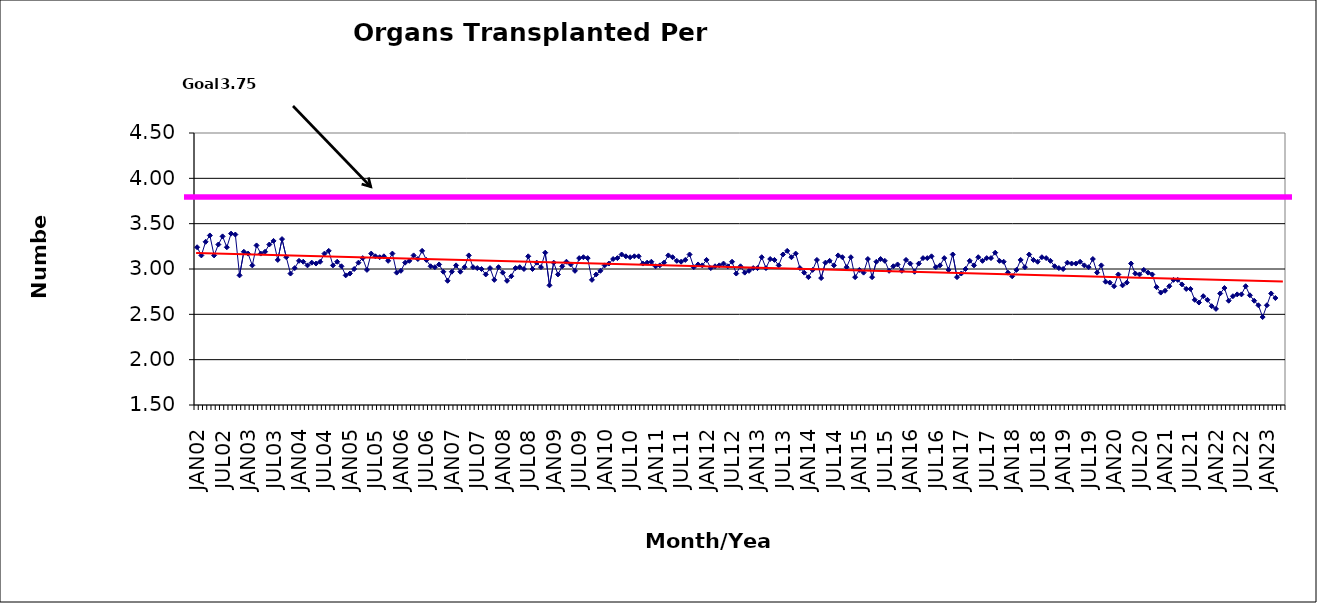
| Category | Series 0 |
|---|---|
| JAN02 | 3.24 |
| FEB02 | 3.15 |
| MAR02 | 3.3 |
| APR02 | 3.37 |
| MAY02 | 3.15 |
| JUN02 | 3.27 |
| JUL02 | 3.36 |
| AUG02 | 3.24 |
| SEP02 | 3.39 |
| OCT02 | 3.38 |
| NOV02 | 2.93 |
| DEC02 | 3.19 |
| JAN03 | 3.17 |
| FEB03 | 3.04 |
| MAR03 | 3.26 |
| APR03 | 3.17 |
| MAY03 | 3.19 |
| JUN03 | 3.27 |
| JUL03 | 3.31 |
| AUG03 | 3.1 |
| SEP03 | 3.33 |
| OCT03 | 3.13 |
| NOV03 | 2.95 |
| DEC03 | 3.01 |
| JAN04 | 3.09 |
| FEB04 | 3.08 |
| MAR04 | 3.04 |
| APR04 | 3.07 |
| MAY04 | 3.06 |
| JUN04 | 3.08 |
| JUL04 | 3.17 |
| AUG04 | 3.2 |
| SEP04 | 3.04 |
| OCT04 | 3.08 |
| NOV04 | 3.03 |
| DEC04 | 2.93 |
| JAN05 | 2.95 |
| FEB05 | 3 |
| MAR05 | 3.07 |
| APR05 | 3.12 |
| MAY05 | 2.99 |
| JUN05 | 3.17 |
| JUL05 | 3.14 |
| AUG05 | 3.13 |
| SEP05 | 3.14 |
| OCT05 | 3.09 |
| NOV05 | 3.17 |
| DEC05 | 2.96 |
| JAN06 | 2.98 |
| FEB06 | 3.07 |
| MAR06 | 3.09 |
| APR06 | 3.15 |
| MAY06 | 3.11 |
| JUN06 | 3.2 |
| JUL06 | 3.1 |
| AUG06 | 3.03 |
| SEP06 | 3.02 |
| OCT06 | 3.05 |
| NOV06 | 2.97 |
| DEC06 | 2.87 |
| JAN07 | 2.97 |
| FEB07 | 3.04 |
| MAR07 | 2.97 |
| APR07 | 3.02 |
| MAY07 | 3.15 |
| JUN07 | 3.02 |
| JUL07 | 3.01 |
| AUG07 | 3 |
| SEP07 | 2.94 |
| OCT07 | 3.01 |
| NOV07 | 2.88 |
| DEC07 | 3.02 |
| JAN08 | 2.96 |
| FEB08 | 2.87 |
| MAR08 | 2.92 |
| APR08 | 3.01 |
| MAY08 | 3.02 |
| JUN08 | 3 |
| JUL08 | 3.14 |
| AUG08 | 3 |
| SEP08 | 3.07 |
| OCT08 | 3.02 |
| NOV08 | 3.18 |
| DEC08 | 2.82 |
| JAN09 | 3.07 |
| FEB09 | 2.94 |
| MAR09 | 3.03 |
| APR09 | 3.08 |
| MAY09 | 3.05 |
| JUN09 | 2.98 |
| JUL09 | 3.12 |
| AUG09 | 3.13 |
| SEP09 | 3.12 |
| OCT09 | 2.88 |
| NOV09 | 2.94 |
| DEC09 | 2.98 |
| JAN10 | 3.04 |
| FEB10 | 3.06 |
| MAR10 | 3.11 |
| APR10 | 3.12 |
| MAY10 | 3.16 |
| JUN10 | 3.14 |
| JUL10 | 3.13 |
| AUG10 | 3.14 |
| SEP10 | 3.14 |
| OCT10 | 3.06 |
| NOV10 | 3.07 |
| DEC10 | 3.08 |
| JAN11 | 3.03 |
| FEB11 | 3.04 |
| MAR11 | 3.07 |
| APR11 | 3.15 |
| MAY11 | 3.13 |
| JUN11 | 3.09 |
| JUL11 | 3.08 |
| AUG11 | 3.1 |
| SEP11 | 3.16 |
| OCT11 | 3.02 |
| NOV11 | 3.05 |
| DEC11 | 3.04 |
| JAN12 | 3.1 |
| FEB12 | 3.01 |
| MAR12 | 3.03 |
| APR12 | 3.04 |
| MAY12 | 3.06 |
| JUN12 | 3.03 |
| JUL12 | 3.08 |
| AUG12 | 2.95 |
| SEP12 | 3.03 |
| OCT12 | 2.96 |
| NOV12 | 2.98 |
| DEC12 | 3.01 |
| JAN13 | 3.01 |
| FEB13 | 3.13 |
| MAR13 | 3.01 |
| APR13 | 3.11 |
| MAY13 | 3.1 |
| JUN13 | 3.04 |
| JUL13 | 3.16 |
| AUG13 | 3.2 |
| SEP13 | 3.13 |
| OCT13 | 3.17 |
| NOV13 | 3.01 |
| DEC13 | 2.96 |
| JAN14 | 2.91 |
| FEB14 | 2.99 |
| MAR14 | 3.1 |
| APR14 | 2.9 |
| MAY14 | 3.07 |
| JUN14 | 3.09 |
| JUL14 | 3.04 |
| AUG14 | 3.15 |
| SEP14 | 3.13 |
| OCT14 | 3.02 |
| NOV14 | 3.13 |
| DEC14 | 2.91 |
| JAN15 | 2.99 |
| FEB15 | 2.96 |
| MAR15 | 3.11 |
| APR15 | 2.91 |
| MAY15 | 3.08 |
| JUN15 | 3.11 |
| JUL15 | 3.09 |
| AUG15 | 2.98 |
| SEP15 | 3.03 |
| OCT15 | 3.05 |
| NOV15 | 2.98 |
| DEC15 | 3.1 |
| JAN16 | 3.06 |
| FEB16 | 2.97 |
| MAR16 | 3.06 |
| APR16 | 3.12 |
| MAY16 | 3.12 |
| JUN16 | 3.14 |
| JUL16 | 3.02 |
| AUG16 | 3.04 |
| SEP16 | 3.12 |
| OCT16 | 2.99 |
| NOV16 | 3.16 |
| DEC16 | 2.91 |
| JAN17 | 2.95 |
| FEB17 | 3 |
| MAR17 | 3.09 |
| APR17 | 3.04 |
| MAY17 | 3.13 |
| JUN17 | 3.09 |
| JUL17 | 3.12 |
| AUG17 | 3.12 |
| SEP17 | 3.18 |
| OCT17 | 3.09 |
| NOV17 | 3.08 |
| DEC17 | 2.96 |
| JAN18 | 2.92 |
| FEB18 | 2.99 |
| MAR18 | 3.1 |
| APR18 | 3.02 |
| MAY18 | 3.16 |
| JUN18 | 3.1 |
| JUL18 | 3.08 |
| AUG18 | 3.13 |
| SEP18 | 3.12 |
| OCT18 | 3.09 |
| NOV18 | 3.03 |
| DEC18 | 3.01 |
| JAN19 | 3 |
| FEB19 | 3.07 |
| MAR19 | 3.06 |
| APR19 | 3.06 |
| MAY19 | 3.08 |
| JUN19 | 3.04 |
| JUL19 | 3.02 |
| AUG19 | 3.11 |
| SEP19 | 2.96 |
| OCT19 | 3.04 |
| NOV19 | 2.86 |
| DEC19 | 2.85 |
| JAN20 | 2.81 |
| FEB20 | 2.94 |
| MAR20 | 2.82 |
| APR20 | 2.85 |
| MAY20 | 3.06 |
| JUN20 | 2.95 |
| JUL20 | 2.94 |
| AUG20 | 2.99 |
| SEP20 | 2.96 |
| OCT20 | 2.94 |
| NOV20 | 2.8 |
| DEC20 | 2.74 |
| JAN21 | 2.76 |
| FEB21 | 2.81 |
| MAR21 | 2.88 |
| APR21 | 2.88 |
| MAY21 | 2.83 |
| JUN21 | 2.78 |
| JUL21 | 2.78 |
| AUG21 | 2.66 |
| SEP21 | 2.63 |
| OCT21 | 2.7 |
| NOV21 | 2.66 |
| DEC21 | 2.59 |
| JAN22 | 2.56 |
| FEB22 | 2.73 |
| MAR22 | 2.79 |
| APR22 | 2.65 |
| MAY22 | 2.7 |
| JUN22 | 2.72 |
| JUL22 | 2.72 |
| AUG22 | 2.81 |
| SEP22 | 2.71 |
| OCT22 | 2.65 |
| NOV22 | 2.6 |
| DEC22 | 2.47 |
| JAN23 | 2.6 |
| FEB23 | 2.73 |
| MAR23 | 2.68 |